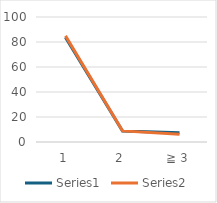
| Category | Series 0 | Series 1 |
|---|---|---|
| 1 | 83.706 | 84.896 |
| 2 | 8.85 | 8.887 |
| ≧ 3 | 7.444 | 6.216 |